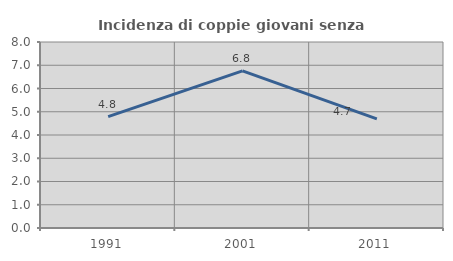
| Category | Incidenza di coppie giovani senza figli |
|---|---|
| 1991.0 | 4.794 |
| 2001.0 | 6.758 |
| 2011.0 | 4.693 |